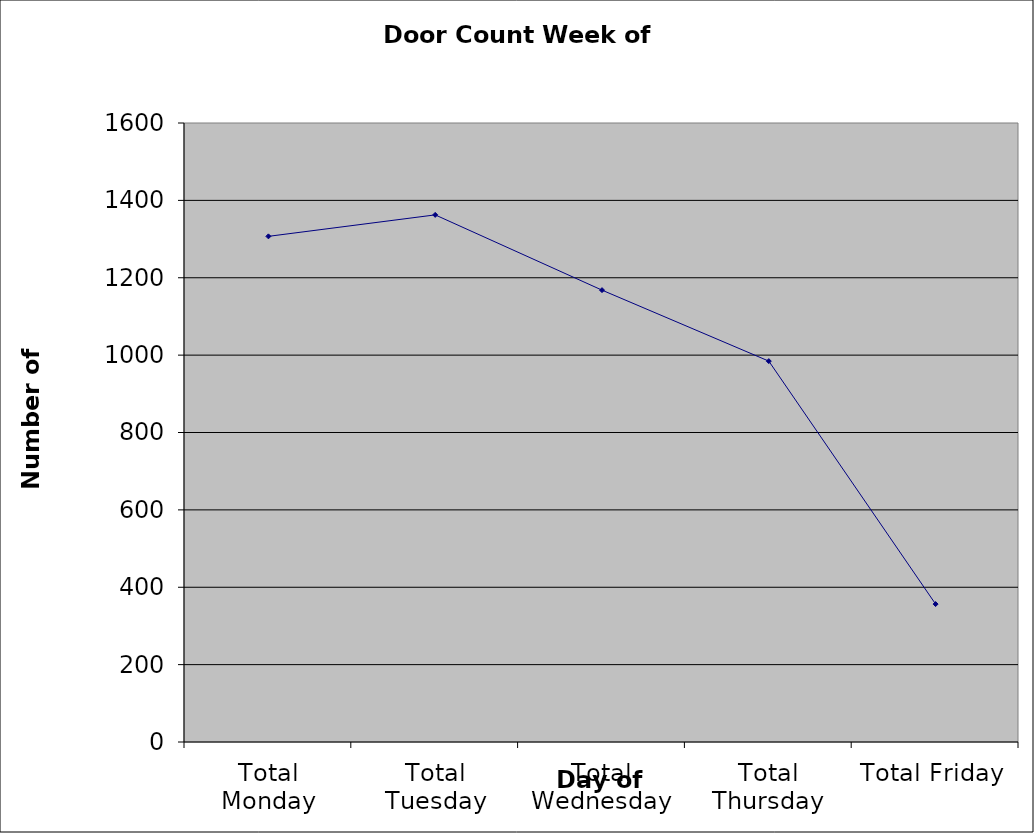
| Category | Series 0 |
|---|---|
| Total Monday | 1307 |
| Total Tuesday | 1362.5 |
| Total Wednesday | 1168 |
| Total Thursday | 984.5 |
| Total Friday | 356.5 |